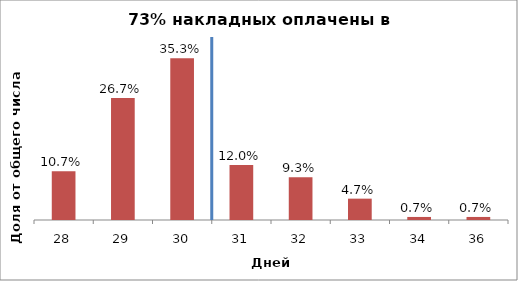
| Category | Доля накладных |
|---|---|
| 28.0 | 0.107 |
| 29.0 | 0.267 |
| 30.0 | 0.353 |
| 31.0 | 0.12 |
| 32.0 | 0.093 |
| 33.0 | 0.047 |
| 34.0 | 0.007 |
| 36.0 | 0.007 |